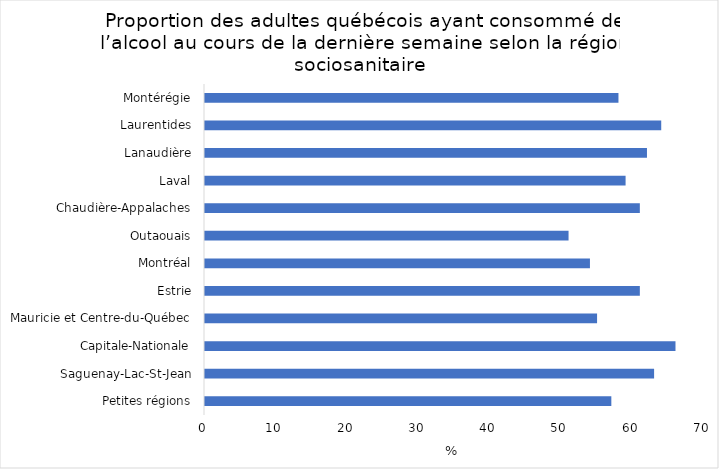
| Category | Series 0 |
|---|---|
| Petites régions | 57 |
| Saguenay-Lac-St-Jean | 63 |
| Capitale-Nationale | 66 |
| Mauricie et Centre-du-Québec | 55 |
| Estrie | 61 |
| Montréal | 54 |
| Outaouais | 51 |
| Chaudière-Appalaches | 61 |
| Laval | 59 |
| Lanaudière | 62 |
| Laurentides | 64 |
| Montérégie | 58 |